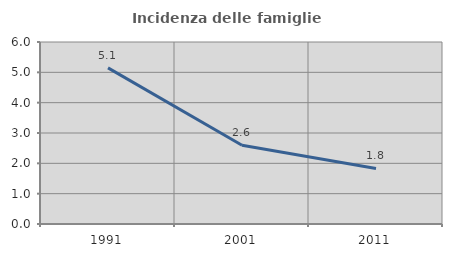
| Category | Incidenza delle famiglie numerose |
|---|---|
| 1991.0 | 5.145 |
| 2001.0 | 2.599 |
| 2011.0 | 1.833 |